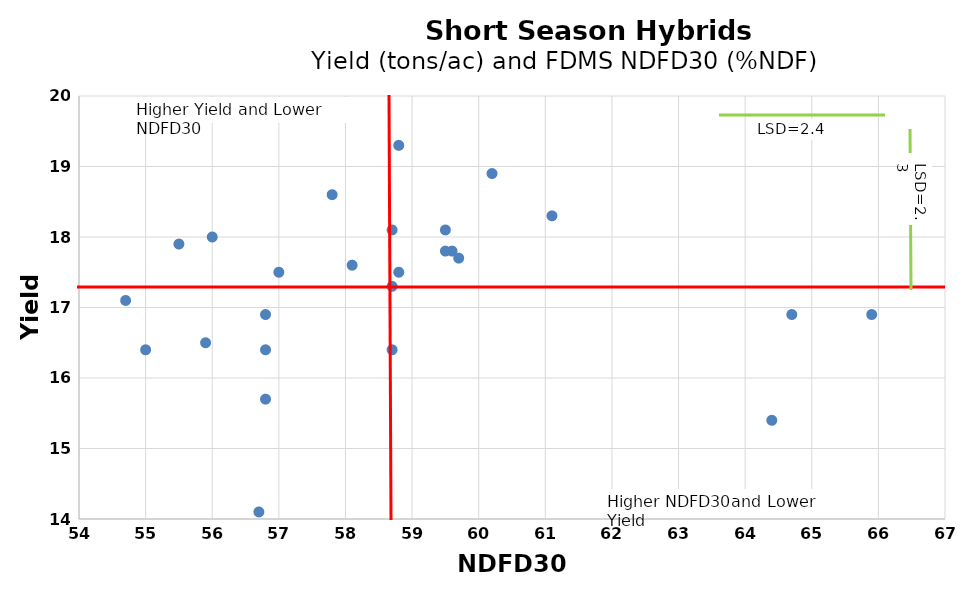
| Category | Series 0 |
|---|---|
| 56.7 | 14.1 |
| 55.5 | 17.9 |
| 58.8 | 19.3 |
| 58.8 | 17.5 |
| 55.9 | 16.5 |
| 58.1 | 17.6 |
| 58.7 | 17.3 |
| 57.8 | 18.6 |
| 64.7 | 16.9 |
| 58.7 | 16.4 |
| 56.8 | 16.9 |
| 56.0 | 18 |
| 58.7 | 18.1 |
| 59.7 | 17.7 |
| 59.5 | 18.1 |
| 57.0 | 17.5 |
| 59.5 | 17.8 |
| 56.8 | 16.4 |
| 54.7 | 17.1 |
| 59.6 | 17.8 |
| 56.8 | 15.7 |
| 55.0 | 16.4 |
| 60.2 | 18.9 |
| 64.4 | 15.4 |
| 61.1 | 18.3 |
| 65.9 | 16.9 |